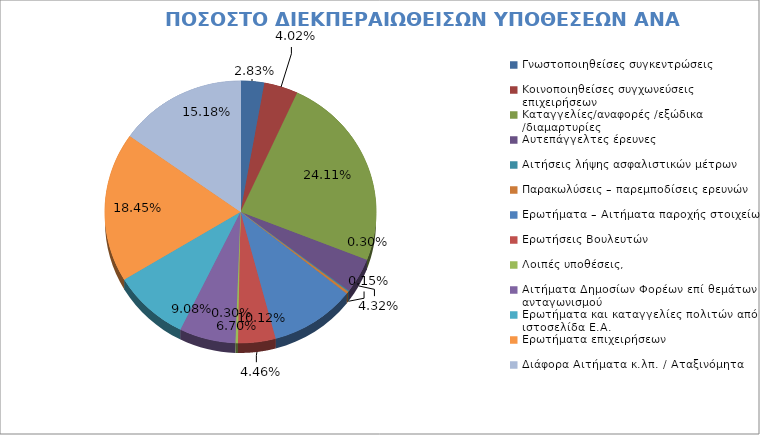
| Category | Series 0 |
|---|---|
| Γνωστοποιηθείσες συγκεντρώσεις | 0.028 |
| Κοινοποιηθείσες συγχωνεύσεις επιχειρήσεων | 0.04 |
| Καταγγελίες/αναφορές /εξώδικα /διαμαρτυρίες | 0.241 |
| Αυτεπάγγελτες έρευνες  | 0.043 |
| Αιτήσεις λήψης ασφαλιστικών μέτρων | 0.001 |
| Παρακωλύσεις – παρεμποδίσεις ερευνών | 0.003 |
| Ερωτήματα – Αιτήματα παροχής στοιχείων  | 0.101 |
| Ερωτήσεις Βουλευτών | 0.045 |
| Λοιπές υποθέσεις,  | 0.003 |
| Αιτήματα Δημοσίων Φορέων επί θεμάτων ανταγωνισμού | 0.067 |
| Ερωτήματα και καταγγελίες πολιτών από ιστοσελίδα Ε.Α. | 0.091 |
| Ερωτήματα επιχειρήσεων | 0.185 |
| Διάφορα Αιτήματα κ.λπ. / Αταξινόμητα | 0.152 |